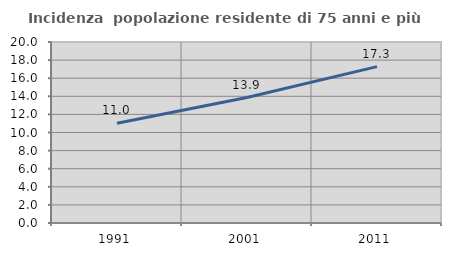
| Category | Incidenza  popolazione residente di 75 anni e più |
|---|---|
| 1991.0 | 11.025 |
| 2001.0 | 13.861 |
| 2011.0 | 17.278 |